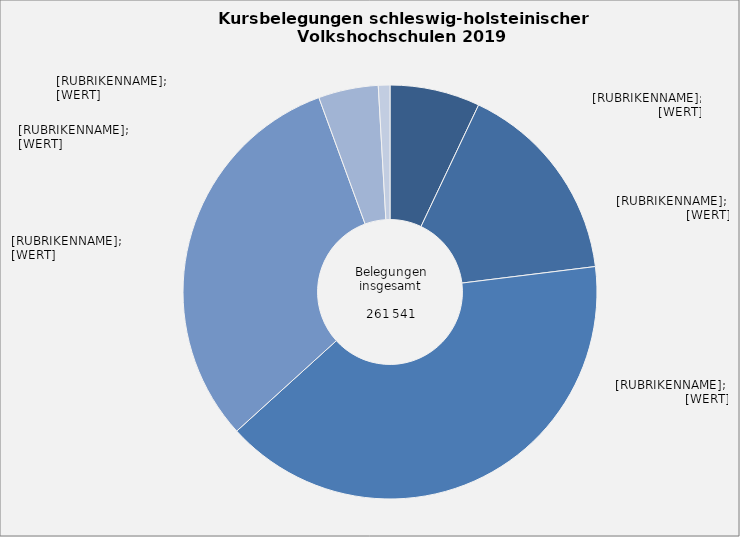
| Category | Anteil in Prozent |
|---|---|
| Politik, Gesellschaft, Umwelt | 0.07 |
| Kultur, Gestalten | 0.16 |
| Gesundheit | 0.402 |
| Sprachen | 0.311 |
| Arbeit, Beruf | 0.047 |
| Grundbildung, Schulabschlüsse | 0.009 |